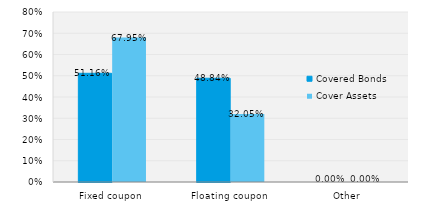
| Category | Covered Bonds | Cover Assets |
|---|---|---|
| Fixed coupon | 0.512 | 0.68 |
| Floating coupon | 0.488 | 0.32 |
| Other | 0 | 0 |